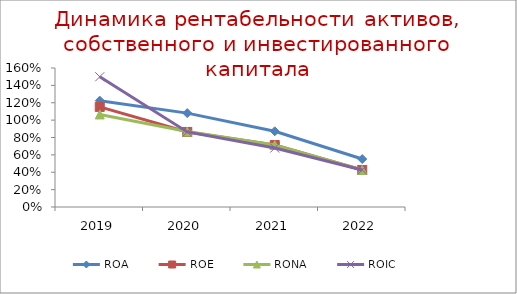
| Category | ROA | ROE | RONA | ROIC |
|---|---|---|---|---|
| 2019.0 | 1.224 | 1.152 | 1.065 | 1.499 |
| 2020.0 | 1.081 | 0.864 | 0.868 | 0.864 |
| 2021.0 | 0.872 | 0.714 | 0.715 | 0.679 |
| 2022.0 | 0.552 | 0.427 | 0.427 | 0.427 |